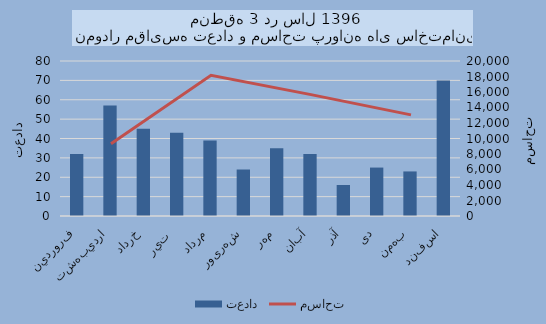
| Category | تعداد |
|---|---|
| فروردين | 32 |
| ارديبهشت | 57 |
| خرداد | 45 |
| تير  | 43 |
| مرداد | 39 |
| شهریور | 24 |
| مهر | 35 |
| آبان | 32 |
| آذر | 16 |
| دی | 25 |
| بهمن | 23 |
| اسفند | 70 |